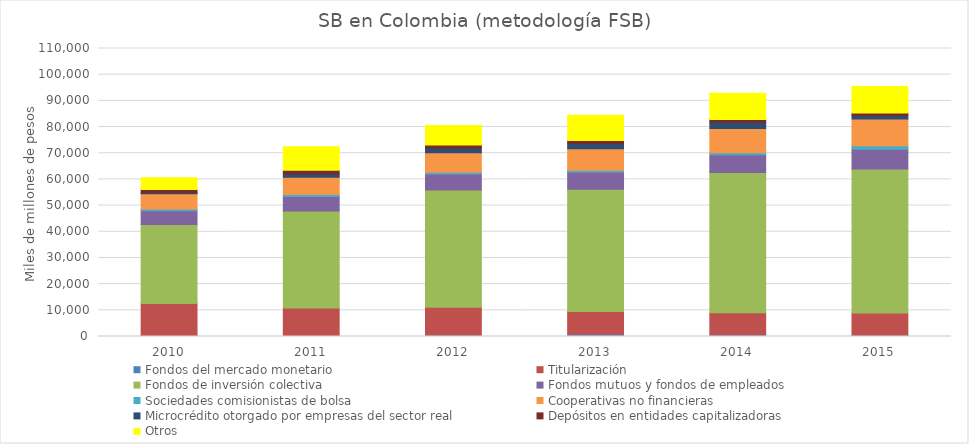
| Category | Fondos del mercado monetario | Titularización | Fondos de inversión colectiva | Fondos mutuos y fondos de empleados | Sociedades comisionistas de bolsa | Cooperativas no financieras | Microcrédito otorgado por empresas del sector real | Depósitos en entidades capitalizadoras | Otros |
|---|---|---|---|---|---|---|---|---|---|
| 2010.0 | 335.032 | 12259.441 | 30158.816 | 5247.542 | 687.71 | 5797.089 | 430.58 | 1267.51 | 4495.985 |
| 2011.0 | 287.208 | 10585.271 | 37088.577 | 5549.666 | 701.64 | 6636.588 | 1246.63 | 1386.88 | 9018.553 |
| 2012.0 | 581.806 | 10547.634 | 44808.178 | 6124.881 | 657.55 | 7420.987 | 1730.78 | 1308.481 | 7440.637 |
| 2013.0 | 842.177 | 8749.206 | 46615.553 | 6652.252 | 642.831 | 8215.975 | 2015.124 | 1123.068 | 9633.491 |
| 2014.0 | 656.107 | 8451.354 | 53501.492 | 6852.137 | 686.229 | 9317.246 | 2326.298 | 1054.932 | 10097.629 |
| 2015.0 | 452.643 | 8497.578 | 55053.402 | 7521.591 | 1314.463 | 10261.878 | 1284.219 | 1006.062 | 10101.168 |